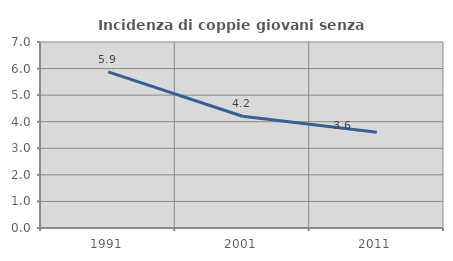
| Category | Incidenza di coppie giovani senza figli |
|---|---|
| 1991.0 | 5.878 |
| 2001.0 | 4.205 |
| 2011.0 | 3.602 |